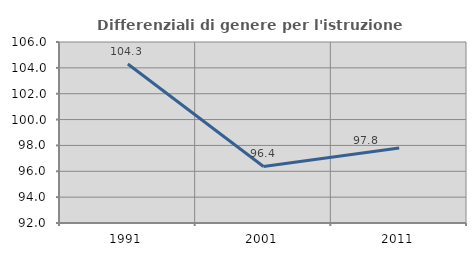
| Category | Differenziali di genere per l'istruzione superiore |
|---|---|
| 1991.0 | 104.3 |
| 2001.0 | 96.372 |
| 2011.0 | 97.808 |